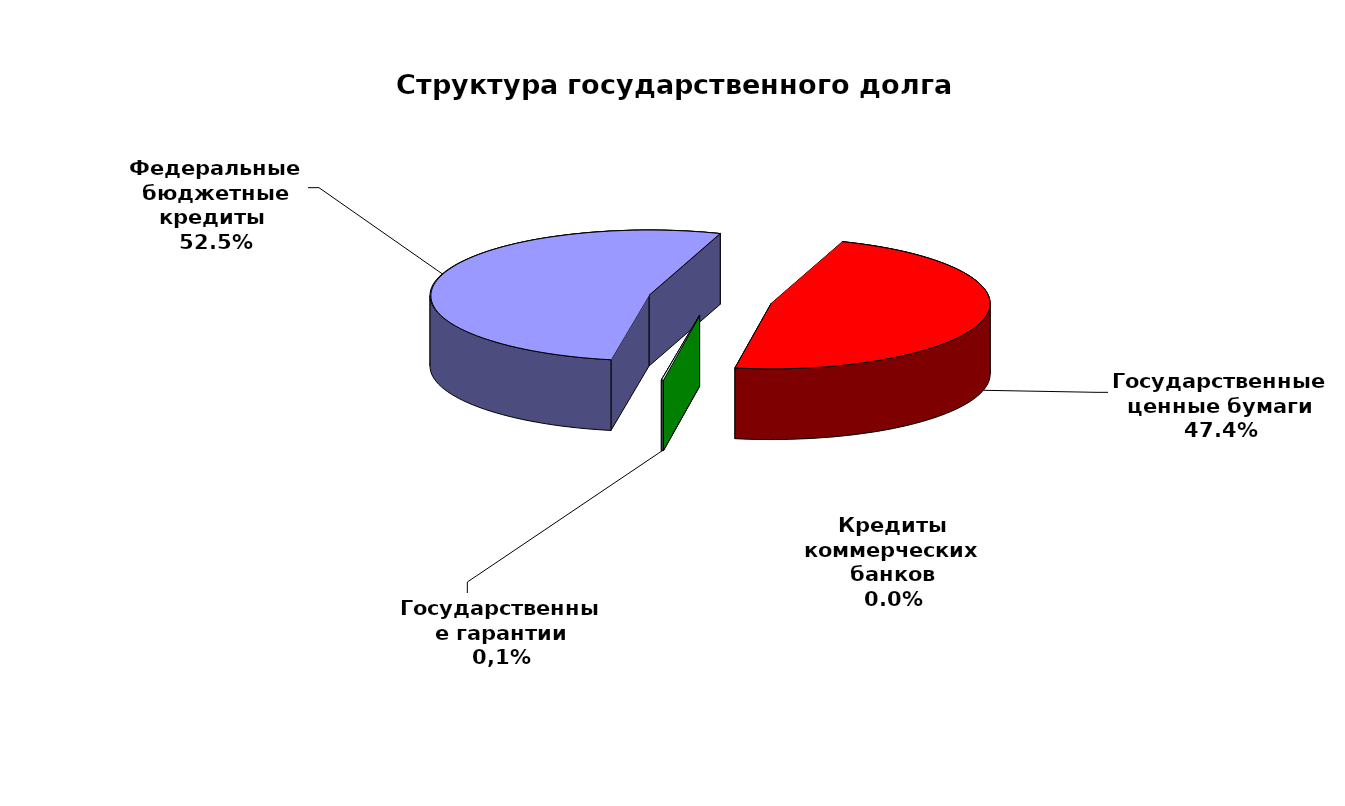
| Category | Series 0 |
|---|---|
| Федеральные бюджетные кредиты  | 54970753.113 |
| Государственные ценные бумаги | 49600000 |
| Кредиты коммерческих банков | 0 |
| Государственные гарантии | 139748.87 |